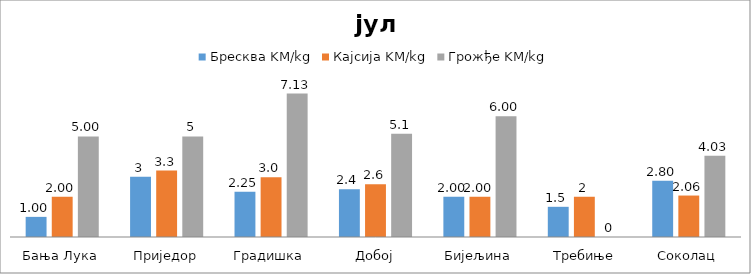
| Category | Бресква KM/kg | Кајсија KM/kg | Грожђе KM/kg |
|---|---|---|---|
| Бања Лука | 1 | 2 | 5 |
| Приједор | 3 | 3.3 | 5 |
| Градишка | 2.25 | 2.975 | 7.125 |
| Добој | 2.375 | 2.625 | 5.125 |
| Бијељина | 2 | 2 | 6 |
|  Требиње | 1.5 | 2 | 0 |
| Соколац | 2.8 | 2.06 | 4.033 |